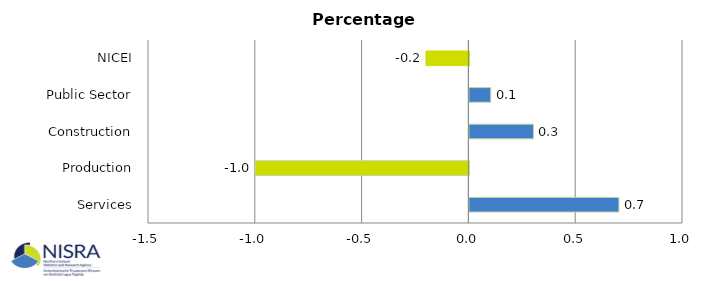
| Category | Percentage Points |
|---|---|
| Services | 0.7 |
| Production | -1 |
| Construction | 0.3 |
| Public Sector | 0.1 |
| NICEI | -0.2 |